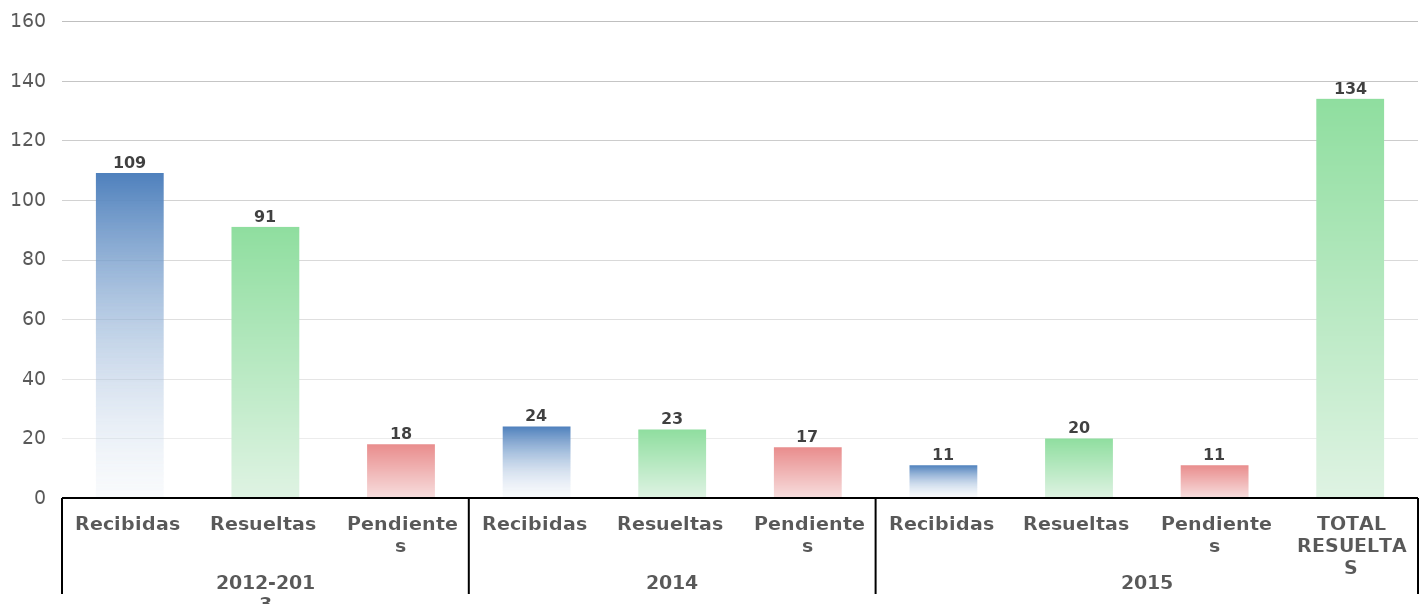
| Category | Series 0 |
|---|---|
| 0 | 109 |
| 1 | 91 |
| 2 | 18 |
| 3 | 24 |
| 4 | 23 |
| 5 | 17 |
| 6 | 11 |
| 7 | 20 |
| 8 | 11 |
| 9 | 134 |